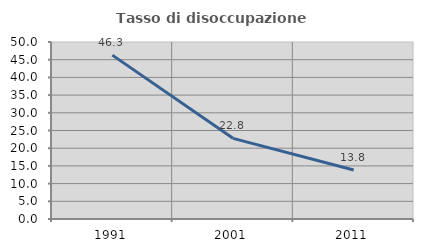
| Category | Tasso di disoccupazione giovanile  |
|---|---|
| 1991.0 | 46.29 |
| 2001.0 | 22.785 |
| 2011.0 | 13.821 |